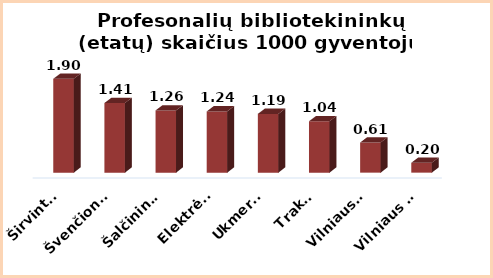
| Category | Series 0 |
|---|---|
| Širvintos | 1.9 |
| Švenčionys | 1.41 |
| Šalčininkai | 1.26 |
| Elektrėnai | 1.24 |
| Ukmergė | 1.19 |
| Trakai | 1.04 |
| Vilniaus r. | 0.61 |
| Vilniaus m. | 0.2 |